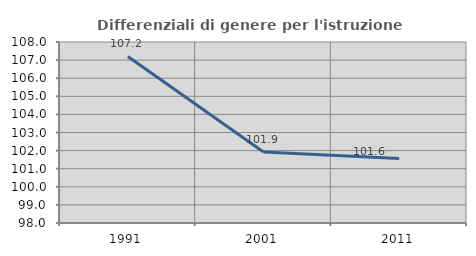
| Category | Differenziali di genere per l'istruzione superiore |
|---|---|
| 1991.0 | 107.203 |
| 2001.0 | 101.925 |
| 2011.0 | 101.559 |